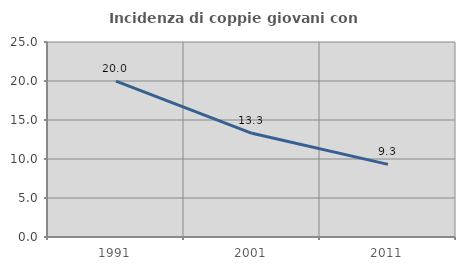
| Category | Incidenza di coppie giovani con figli |
|---|---|
| 1991.0 | 19.978 |
| 2001.0 | 13.298 |
| 2011.0 | 9.313 |